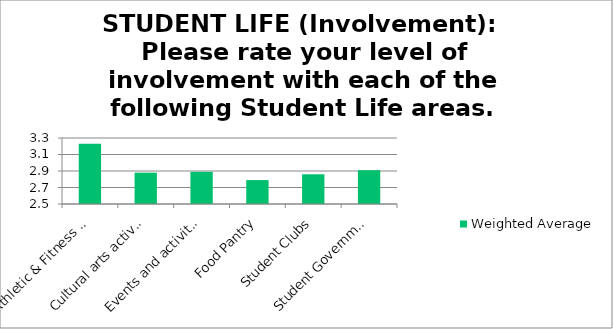
| Category | Weighted Average |
|---|---|
| Athletic & Fitness Center (if available) | 3.23 |
| Cultural arts activities (art galleries, plays, concerts, etc.) | 2.88 |
| Events and activities for students (speakers, movies, trips, etc.) | 2.89 |
| Food Pantry | 2.79 |
| Student Clubs | 2.86 |
| Student Government | 2.91 |